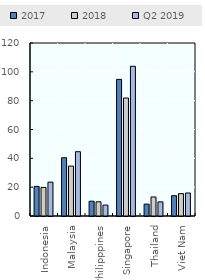
| Category | 2017 | 2018 | Q2 2019 |
|---|---|---|---|
| Indonesia | 20.51 | 19.821 | 23.478 |
| Malaysia | 40.405 | 34.632 | 44.601 |
| Philipppines | 10.256 | 9.832 | 7.566 |
| Singapore | 94.755 | 81.856 | 103.856 |
| Thailand | 8.229 | 13.205 | 9.795 |
| Viet Nam | 14.1 | 15.5 | 15.96 |